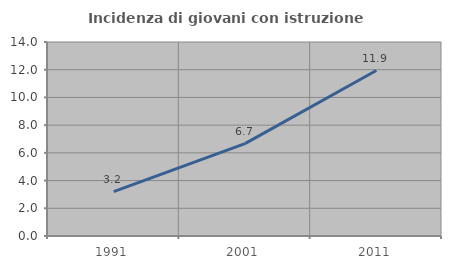
| Category | Incidenza di giovani con istruzione universitaria |
|---|---|
| 1991.0 | 3.205 |
| 2001.0 | 6.667 |
| 2011.0 | 11.94 |